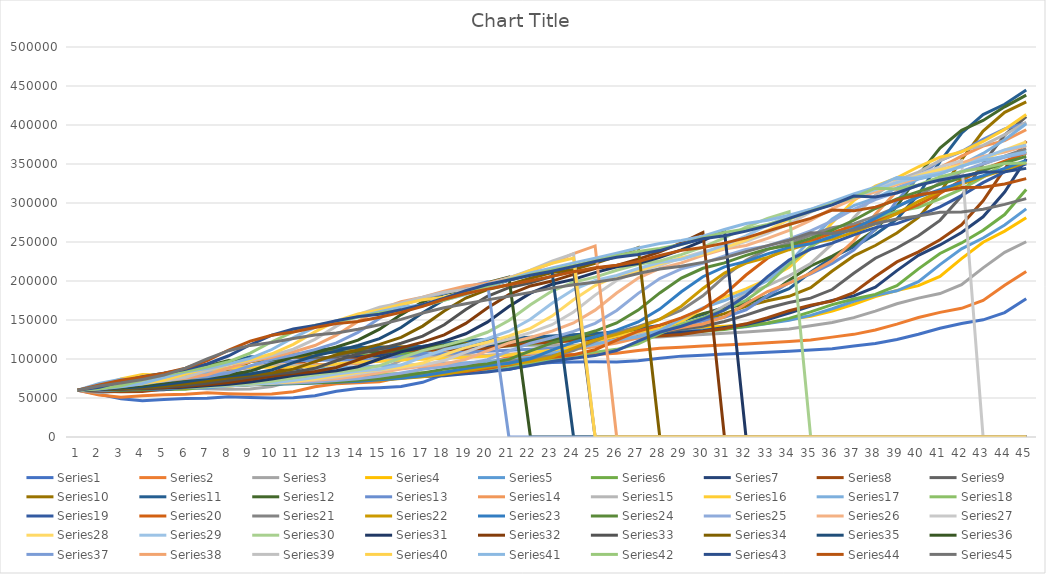
| Category | Series 0 | Series 1 | Series 2 | Series 3 | Series 4 | Series 5 | Series 6 | Series 7 | Series 8 | Series 9 | Series 10 | Series 11 | Series 12 | Series 13 | Series 14 | Series 15 | Series 16 | Series 17 | Series 18 | Series 19 | Series 20 | Series 21 | Series 22 | Series 23 | Series 24 | Series 25 | Series 26 | Series 27 | Series 28 | Series 29 | Series 30 | Series 31 | Series 32 | Series 33 | Series 34 | Series 35 | Series 36 | Series 37 | Series 38 | Series 39 | Series 40 | Series 41 | Series 42 | Series 43 | Series 44 |
|---|---|---|---|---|---|---|---|---|---|---|---|---|---|---|---|---|---|---|---|---|---|---|---|---|---|---|---|---|---|---|---|---|---|---|---|---|---|---|---|---|---|---|---|---|---|
| 0 | 60000 | 60000 | 60000 | 60000 | 60000 | 60000 | 60000 | 60000 | 60000 | 60000 | 60000 | 60000 | 60000 | 60000 | 60000 | 60000 | 60000 | 60000 | 60000 | 60000 | 60000 | 60000 | 60000 | 60000 | 60000 | 60000 | 60000 | 60000 | 60000 | 60000 | 60000 | 60000 | 60000 | 60000 | 60000 | 60000 | 60000 | 60000 | 60000 | 60000 | 60000 | 60000 | 60000 | 60000 | 60000 |
| 1 | 54640.719 | 53819.178 | 56884.545 | 62087.629 | 61531.756 | 60619.308 | 62235.577 | 58783.314 | 59219.397 | 60431.396 | 63069.601 | 66553.48 | 63581.633 | 60982.186 | 61364.282 | 65085.688 | 68633.646 | 64613.662 | 59417.678 | 60651.033 | 64716.066 | 61367.576 | 60489.642 | 60186.799 | 59832.402 | 60915.033 | 62004.905 | 61637.496 | 60606.411 | 60874.786 | 60642.434 | 60719.264 | 60743.802 | 60767.347 | 60951.102 | 61809.045 | 61663.671 | 62563.078 | 63277.432 | 63502.953 | 62575.66 | 61963.367 | 63706.656 | 66632.883 | 65485.888 |
| 2 | 49011.976 | 51024.658 | 58863.775 | 63672.68 | 62166.874 | 62877.96 | 60973.558 | 58018.54 | 59645.18 | 63523.068 | 69958.358 | 70526.316 | 64622.449 | 62368.801 | 66565.609 | 74451.135 | 73911.187 | 63986.562 | 60062.392 | 65418.271 | 66191.136 | 61868.379 | 60677.966 | 60018.68 | 60744.879 | 62950.514 | 63697.118 | 62260.457 | 61490.038 | 61526.587 | 61369.4 | 61471.982 | 61520.661 | 61730.612 | 62788.823 | 63522.878 | 64297.818 | 65980.515 | 66971.73 | 66228.987 | 64623.31 | 65791.315 | 70749.303 | 72725.225 | 69247.93 |
| 3 | 46467.066 | 52800 | 60366.524 | 64329.897 | 64483.188 | 61602.914 | 60180.288 | 58435.689 | 62696.629 | 70461.354 | 74134.444 | 71680.815 | 66091.837 | 67655.272 | 76144.008 | 80176.007 | 73193.851 | 64680.851 | 64783.362 | 66909.345 | 66731.302 | 62060.995 | 60508.475 | 60933.997 | 62774.674 | 64668.534 | 64340.895 | 63168.199 | 62148.426 | 62264.151 | 62130.178 | 62258.154 | 62495.868 | 63591.837 | 64529.823 | 66236.445 | 67810.013 | 69832.626 | 69846.67 | 68396.184 | 68615.583 | 73064.417 | 77218.015 | 76903.153 | 73750.211 |
| 4 | 48083.832 | 54147.945 | 60989.615 | 66726.804 | 63175.592 | 60801.457 | 60612.981 | 61425.261 | 69544.648 | 74667.466 | 75348.007 | 73310.696 | 71693.878 | 77390.467 | 81999.053 | 79397.869 | 73988.044 | 69764.838 | 66259.965 | 67455.373 | 66939.058 | 61887.64 | 61431.262 | 62970.112 | 64487.896 | 65322.129 | 65278.97 | 63844.557 | 62893.445 | 63036.021 | 62924.768 | 63245.052 | 64380.165 | 65355.102 | 67286.405 | 69854.536 | 71768.935 | 72830.377 | 72132.247 | 72621.536 | 76200.901 | 79744.803 | 81654.045 | 81903.153 | 79378.063 |
| 5 | 49311.377 | 54706.849 | 63262.065 | 65373.711 | 62353.674 | 61238.616 | 63713.942 | 68134.415 | 73696.038 | 75889.754 | 77061.273 | 79524.618 | 82010.204 | 83341.358 | 81203.221 | 80259.379 | 79803.587 | 71354.983 | 66800.693 | 67665.383 | 66752.078 | 62831.461 | 63483.992 | 64688.667 | 65139.665 | 66274.51 | 65977.928 | 64609.908 | 63673.116 | 63842.196 | 63922.232 | 65151.938 | 66165.289 | 68146.939 | 70961.848 | 73932.822 | 74849.807 | 75213.59 | 76588.404 | 80649.705 | 83168.062 | 84325.993 | 86962.933 | 88153.153 | 88311.644 |
| 6 | 49820.359 | 56745.205 | 61979.23 | 64523.196 | 62801.993 | 64371.585 | 70673.077 | 72201.622 | 74902.425 | 77615.339 | 83593.099 | 90967.742 | 88316.327 | 82532.499 | 82084.32 | 86567.855 | 81622.545 | 71937.29 | 67008.666 | 67476.374 | 67770.083 | 64930.979 | 65216.572 | 65342.466 | 66089.385 | 66984.127 | 66768.853 | 65410.857 | 64487.439 | 64854.202 | 65849.535 | 66958.461 | 68991.736 | 71869.388 | 75104.782 | 77106.586 | 77299.101 | 79860.105 | 85055.103 | 88023.626 | 87945.911 | 89808.603 | 93599.043 | 98074.324 | 100277.167 |
| 7 | 51676.647 | 55594.521 | 61172.877 | 64987.113 | 66014.944 | 71402.55 | 74891.827 | 73383.546 | 76605.559 | 84194.128 | 95621.654 | 97962.649 | 87459.184 | 83428.021 | 88536.239 | 88540.991 | 82288.642 | 72161.254 | 66821.49 | 68505.425 | 70034.626 | 66703.05 | 65875.706 | 66295.143 | 66797.02 | 67787.115 | 67596.567 | 66247.404 | 65509.674 | 66809.605 | 67675.402 | 69818.79 | 72760.331 | 76065.306 | 78328.855 | 79629.728 | 82074.454 | 88688.484 | 92831.816 | 93080.418 | 93663.876 | 96661.865 | 104133.121 | 111362.613 | 110640.527 |
| 8 | 50628.743 | 54871.233 | 61612.706 | 68311.856 | 73225.405 | 75664.845 | 76117.788 | 75052.144 | 83098.758 | 96309.167 | 102974.42 | 97011.885 | 88408.163 | 89985.556 | 90554.24 | 89263.548 | 82544.833 | 71959.686 | 67840.555 | 70794.54 | 71945.983 | 67377.207 | 66836.158 | 67004.981 | 67597.765 | 68627.451 | 68461.067 | 67297.538 | 67484.84 | 68662.093 | 70566.357 | 73632.562 | 77008.264 | 79330.612 | 80891.994 | 84549.061 | 91147.625 | 96797.402 | 98164.83 | 99132.213 | 100811.333 | 107540.646 | 118242.328 | 122871.622 | 117424.37 |
| 9 | 49970.06 | 55265.753 | 64764.814 | 75773.196 | 77596.513 | 76903.461 | 77848.558 | 81413.673 | 95056.18 | 103714.799 | 101975.015 | 98064.516 | 95357.143 | 92036.591 | 91293.226 | 89541.454 | 82314.261 | 73057.111 | 70107.452 | 72726.636 | 72673.13 | 68359.551 | 67551.789 | 67808.219 | 68435.754 | 69505.135 | 69546.291 | 69326.609 | 69356.05 | 71595.197 | 74420.964 | 77931.419 | 80314.05 | 81926.531 | 85889.307 | 93895.795 | 99481.386 | 102358.231 | 104547.197 | 106696.956 | 112157.115 | 122111.546 | 130462.336 | 130405.405 | 121196.552 |
| 10 | 50329.341 | 58093.151 | 71838.729 | 80296.392 | 78866.75 | 78652.095 | 84447.115 | 93128.621 | 102365.464 | 102708.209 | 103081.499 | 105772.496 | 97530.612 | 92787.675 | 91577.451 | 89291.339 | 83569.599 | 75498.32 | 72020.797 | 73461.673 | 73732.687 | 69091.493 | 68361.582 | 68648.817 | 69310.987 | 70606.909 | 71643.164 | 71248.888 | 72318.799 | 75506.003 | 78765.85 | 81276.833 | 82942.149 | 86987.755 | 95384.202 | 102480.825 | 105196.406 | 109013.24 | 112525.156 | 118705.134 | 127353.509 | 134731.426 | 138461.538 | 134594.595 | 126408.653 |
| 11 | 52904.192 | 64438.356 | 76127.062 | 81610.825 | 80660.025 | 85318.761 | 96598.558 | 100289.687 | 101371.969 | 103822.648 | 111183.819 | 108183.362 | 98326.531 | 93076.553 | 91321.648 | 90653.08 | 86362.084 | 77558.791 | 72748.7 | 74532.727 | 74522.161 | 69919.743 | 69209.04 | 69526.775 | 70409.683 | 72735.761 | 73629.675 | 74292.495 | 76269.131 | 79914.237 | 82147.084 | 83936.437 | 88066.116 | 96604.082 | 104105.32 | 108368.157 | 112035.944 | 117332.001 | 125189.267 | 134788.732 | 140515.132 | 142992.385 | 142909.526 | 140382.883 | 130890.654 |
| 12 | 58682.635 | 68284.932 | 77373.244 | 83466.495 | 87496.887 | 97595.628 | 104026.442 | 99316.338 | 102471.91 | 111983.223 | 113718.025 | 109066.214 | 98632.653 | 92816.562 | 92714.353 | 93682.26 | 88719.044 | 78342.665 | 73809.359 | 75330.767 | 75415.512 | 70786.517 | 70094.162 | 70628.892 | 72532.588 | 74752.568 | 76774.985 | 78350.638 | 80721.917 | 83344.768 | 84835.165 | 89121.829 | 97801.653 | 105436.735 | 110085.975 | 115413.912 | 120585.366 | 130537.097 | 142151.414 | 148718.764 | 149130.715 | 147585.923 | 149055.4 | 145360.36 | 133375.021 |
| 13 | 62185.629 | 69402.74 | 79132.56 | 90541.237 | 100087.173 | 105100.182 | 103016.827 | 100393.975 | 110526.316 | 114535.65 | 114646.044 | 109405.772 | 98357.143 | 94232.065 | 95812.411 | 96239 | 89615.713 | 79484.882 | 74599.653 | 76233.812 | 76350.416 | 71691.814 | 71205.273 | 72758.406 | 74543.762 | 77945.845 | 80968.731 | 82924.948 | 84187.121 | 86072.041 | 90076.078 | 98974.073 | 106743.802 | 111493.878 | 117243.417 | 124221.106 | 134156.611 | 148223.832 | 156842.357 | 157837.347 | 153921.442 | 153932.908 | 154340.375 | 148119.369 | 138262.633 |
| 14 | 63203.593 | 70980.822 | 85839.951 | 103569.588 | 107783.313 | 104080.146 | 104134.615 | 108285.052 | 113045.535 | 115470.342 | 115002.974 | 109100.17 | 99857.143 | 97380.838 | 98427.286 | 97211.672 | 90922.289 | 80335.946 | 75493.934 | 77178.859 | 77326.87 | 72828.25 | 73352.166 | 74775.841 | 77728.119 | 82203.548 | 85695.892 | 86484.723 | 86941.958 | 91389.365 | 100033.812 | 108023.418 | 112876.033 | 118742.857 | 126190.22 | 138201.534 | 152333.761 | 163542.343 | 166459.032 | 162907.769 | 160540.889 | 159390.821 | 157269.829 | 153547.297 | 143900.625 |
| 15 | 64640.719 | 76997.26 | 98191.814 | 111533.505 | 106737.235 | 105209.472 | 112319.711 | 110753.187 | 113968.066 | 115829.838 | 114681.737 | 110764.007 | 103193.878 | 100038.517 | 99422.075 | 98628.995 | 91895.816 | 81298.992 | 76429.809 | 78165.908 | 78552.632 | 75024.077 | 75386.064 | 77970.112 | 81973.929 | 87002.801 | 89374.617 | 89314.743 | 92313.023 | 101492.281 | 109180.051 | 114229.161 | 120214.876 | 127804.082 | 140392.262 | 156926.739 | 168077.022 | 173569.823 | 171806.421 | 169913.676 | 166233.097 | 162416.135 | 163033.081 | 159808.559 | 150846.713 |
| 16 | 70119.76 | 88076.712 | 105742.211 | 110451.031 | 107895.392 | 113479.053 | 114879.808 | 111657.01 | 114322.886 | 115506.291 | 116430.696 | 114465.195 | 106010.204 | 101049.591 | 100871.625 | 99685.039 | 92997.438 | 82306.831 | 77407.279 | 79404.97 | 80921.053 | 77104.334 | 78606.403 | 82229.141 | 86759.777 | 90737.628 | 92299.203 | 94832.394 | 102518.048 | 110771.87 | 115452.24 | 121655.98 | 129388.43 | 142187.755 | 159414.293 | 173144.671 | 178382.542 | 179145.641 | 179195.017 | 175938.21 | 169388.281 | 168367.977 | 169681.148 | 167522.523 | 158989.353 |
| 17 | 80209.581 | 94849.315 | 104715.944 | 111649.485 | 116376.09 | 116065.574 | 115817.308 | 112004.635 | 114003.548 | 117267.825 | 120321.237 | 117589.134 | 107081.633 | 102522.87 | 101951.682 | 100880.037 | 94150.299 | 83359.462 | 78634.315 | 81799.09 | 83164.82 | 80398.074 | 82900.188 | 87029.888 | 90484.171 | 93706.816 | 98001.226 | 105315.93 | 111891.424 | 117135.506 | 122958.58 | 130939.504 | 143950.413 | 161453.061 | 175889.307 | 183760.91 | 184112.965 | 186849.863 | 185548.634 | 179277.601 | 175595.621 | 175233.587 | 177871.662 | 176565.315 | 165722.495 |
| 18 | 86377.246 | 93928.767 | 105852.169 | 120425.258 | 119028.643 | 117012.75 | 116177.885 | 111691.773 | 115742.164 | 121186.339 | 123604.997 | 118777.589 | 108642.857 | 103620.607 | 103173.851 | 102130.616 | 95354.398 | 84680.851 | 81005.199 | 84067.203 | 86717.452 | 84789.727 | 87740.113 | 90765.878 | 93445.065 | 99495.798 | 108835.071 | 114945.12 | 118319.376 | 124751.286 | 132341.505 | 145676.052 | 163454.545 | 178138.776 | 186673.831 | 189664.11 | 192030.809 | 193474.894 | 189070.436 | 185847.342 | 182755.956 | 183692.118 | 187473.097 | 184042.793 | 170741.93 |
| 19 | 85538.922 | 94947.945 | 114172.266 | 123170.103 | 120000 | 117377.049 | 115853.365 | 113395.133 | 119609.698 | 124493.709 | 124854.253 | 120509.338 | 109806.122 | 104862.783 | 104452.866 | 103436.776 | 96865.927 | 87234.043 | 83251.3 | 87658.383 | 91454.294 | 89739.968 | 91506.591 | 93735.99 | 99217.877 | 110494.865 | 118786.021 | 121548.502 | 126012.128 | 134271.012 | 147235.841 | 165413.995 | 180347.107 | 189061.224 | 192670.607 | 197820.682 | 198839.538 | 197147.14 | 195999.042 | 193425.716 | 191577.592 | 193607.738 | 195412.515 | 189617.117 | 175781.646 |
| 20 | 86467.066 | 102410.959 | 116774.588 | 124175.258 | 120373.599 | 117049.18 | 117620.192 | 117184.241 | 122874.039 | 125751.947 | 126674.598 | 121799.66 | 111122.449 | 106162.735 | 105788.726 | 105076.424 | 99786.507 | 89652.856 | 86807.626 | 92446.622 | 96793.629 | 93592.295 | 94500.942 | 99526.775 | 110186.22 | 120597.572 | 125610.055 | 129451.201 | 135628.068 | 149382.504 | 167185.123 | 182509.06 | 191404.959 | 195134.694 | 200956.475 | 204834.7 | 0 | 204371.721 | 203991.375 | 202762.381 | 201918.867 | 201806.956 | 201331.208 | 195213.964 | 180365.05 |
| 21 | 93263.473 | 104745.206 | 117727.55 | 124561.856 | 120037.36 | 118834.244 | 121550.481 | 120382.387 | 124115.908 | 127585.38 | 128030.934 | 123259.762 | 112500 | 107520.462 | 107465.656 | 108244.558 | 102553.373 | 93482.643 | 91549.393 | 97843.892 | 100948.753 | 96654.896 | 100338.983 | 110529.265 | 120260.708 | 127525.677 | 133776.824 | 139329.576 | 150892.29 | 169622.642 | 184463.229 | 193699.47 | 197553.719 | 203526.531 | 208081.677 | 0 | 0 | 212705.471 | 213838.045 | 213707.406 | 210470.058 | 207919.325 | 207273.814 | 200304.054 | 185425.046 |
| 22 | 95389.222 | 105600 | 118094.074 | 124213.918 | 121867.995 | 122805.1 | 124867.788 | 121599.073 | 125925.488 | 128951.468 | 129565.735 | 124787.776 | 113938.776 | 109224.844 | 110705.827 | 111245.947 | 106934.244 | 98589.026 | 96894.281 | 102044.102 | 104252.078 | 102626.003 | 111431.262 | 120635.118 | 127169.46 | 135816.993 | 143985.285 | 155010.383 | 171336.991 | 187152.659 | 195773.457 | 199921.94 | 206049.587 | 210742.857 | 212031.166 | 0 | 0 | 222972.771 | 225380.93 | 222757.837 | 216844.817 | 214056.39 | 212678.358 | 205923.423 | 190860.233 |
| 23 | 96167.665 | 105928.767 | 117764.203 | 126108.247 | 125940.224 | 126156.648 | 126129.808 | 123371.958 | 127273.802 | 130497.304 | 131171.922 | 126383.701 | 115744.898 | 112518.055 | 113775.462 | 115998.147 | 112775.406 | 104344.905 | 101053.726 | 105383.269 | 110692.521 | 113971.108 | 121619.586 | 127565.38 | 135437.616 | 146181.139 | 160190.067 | 176013.052 | 189044.181 | 198627.787 | 202062.553 | 208519.654 | 213355.372 | 214742.857 | 0 | 0 | 0 | 235008.743 | 234925.731 | 229504.771 | 223245.332 | 219637.786 | 218644.878 | 211959.459 | 195321.954 |
| 24 | 96467.066 | 105632.877 | 119560.171 | 130322.165 | 129377.335 | 127431.694 | 127968.75 | 124692.932 | 128799.527 | 132115.039 | 132849.494 | 128387.097 | 119234.694 | 115637.939 | 118635.718 | 122334.414 | 119359.522 | 108824.188 | 104360.485 | 111893.595 | 122929.363 | 124391.653 | 128606.403 | 135859.278 | 145772.812 | 162633.053 | 181894.543 | 194203.5 | 200635.287 | 205008.576 | 210752.325 | 215913.019 | 0 | 222612.245 | 0 | 0 | 0 | 244961.279 | 0 | 0 | 229066.323 | 225799.547 | 225053.806 | 216914.414 | 198353.896 |
| 25 | 96197.605 | 107243.836 | 123555.284 | 133878.866 | 130684.932 | 129289.617 | 129338.942 | 126187.717 | 130396.215 | 133804.674 | 134955.384 | 132258.065 | 122540.816 | 120577.756 | 125116.059 | 129476.61 | 124483.348 | 112385.218 | 110807.626 | 124263.213 | 134168.975 | 131537.721 | 136967.985 | 146226.65 | 162178.771 | 184668.534 | 200692.827 | 206110.946 | 207080.566 | 213825.043 | 218224.852 | 220011.151 | 0 | 231689.796 | 0 | 0 | 0 | 0 | 0 | 0 | 235492.595 | 232418.193 | 230314.867 | 220281.531 | 202693.933 |
| 26 | 97664.671 | 110827.397 | 126927.306 | 135231.959 | 132590.286 | 130673.953 | 130889.423 | 127752.028 | 132063.868 | 135925.704 | 139024.39 | 135925.297 | 127775.51 | 127164.179 | 132420.654 | 135034.738 | 128556.789 | 119328.108 | 123057.192 | 135624.781 | 141876.731 | 140089.888 | 147419.962 | 162683.686 | 184152.7 | 203753.501 | 212998.161 | 212732.127 | 215986.139 | 221406.518 | 222366.864 | 228073.599 | 0 | 242873.469 | 0 | 0 | 0 | 0 | 0 | 0 | 242395.364 | 237851.41 | 233889.996 | 225101.351 | 209538.618 |
| 27 | 100928.144 | 113852.055 | 128210.14 | 137203.608 | 134009.963 | 132240.437 | 132512.019 | 129385.863 | 134157.303 | 140023.966 | 142879.239 | 141731.749 | 134755.102 | 134588.349 | 138105.163 | 139453.451 | 136498.719 | 132519.597 | 134308.492 | 143416.171 | 151101.108 | 150780.096 | 164011.299 | 184726.027 | 203184.358 | 216246.499 | 219840.589 | 221880.747 | 223644.239 | 225608.919 | 230515.638 | 237373.85 | 0 | 0 | 0 | 0 | 0 | 0 | 0 | 0 | 248061.816 | 241543.527 | 239007.573 | 232702.703 | 215460.537 |
| 28 | 103682.635 | 115002.74 | 130079.414 | 138672.68 | 135616.438 | 133879.781 | 134206.731 | 131436.848 | 138202.247 | 143906.531 | 148982.748 | 149473.684 | 142622.449 | 140365.912 | 142624.349 | 148068.55 | 151588.386 | 144636.058 | 142024.263 | 152740.637 | 162631.579 | 167749.599 | 186233.522 | 203816.936 | 215642.458 | 223193.277 | 229294.911 | 229747.849 | 227889.113 | 233876.501 | 239915.469 | 248831.893 | 0 | 0 | 0 | 0 | 0 | 0 | 0 | 0 | 251912.428 | 246828.566 | 247078.517 | 239279.279 | 218877.81 |
| 29 | 104730.539 | 116679.452 | 131472.205 | 140335.052 | 137297.634 | 135591.985 | 136334.135 | 135399.768 | 142034.299 | 150053.925 | 157120.761 | 158200.34 | 148744.898 | 144959.076 | 151435.339 | 164437.239 | 165448.335 | 152945.129 | 151258.232 | 164396.22 | 180934.903 | 190478.331 | 205480.226 | 216313.823 | 222569.832 | 232791.783 | 237424.893 | 234108.573 | 236240.254 | 243413.379 | 251496.196 | 262263.73 | 0 | 0 | 0 | 0 | 0 | 0 | 0 | 0 | 257424.34 | 255163.614 | 254061.379 | 243074.324 | 223846.544 |
| 30 | 106257.485 | 117928.767 | 133048.259 | 142074.742 | 139053.549 | 137741.348 | 140444.711 | 139154.114 | 148101.715 | 158250.449 | 166293.873 | 164991.511 | 153612.245 | 153914.3 | 168176.22 | 179471.978 | 174953.032 | 162889.138 | 162800.693 | 182898.145 | 205450.138 | 210163.724 | 218079.096 | 223262.765 | 232141.527 | 241045.752 | 241931.33 | 242687.63 | 245873.52 | 255162.95 | 265071.851 | 0 | 0 | 0 | 0 | 0 | 0 | 0 | 0 | 0 | 266117.193 | 262374.974 | 258090.873 | 248592.342 | 229839.446 |
| 31 | 107395.21 | 119342.466 | 134697.618 | 143891.753 | 141257.783 | 141894.353 | 144338.942 | 145098.494 | 156191.603 | 167489.515 | 173432.481 | 170390.492 | 163102.041 | 170929.225 | 183552.819 | 189782.307 | 186327.925 | 175319.149 | 181123.05 | 207679.384 | 226682.825 | 223049.759 | 225084.746 | 232864.259 | 240372.44 | 245620.915 | 250797.057 | 252583.803 | 257741.842 | 268936.535 | 0 | 0 | 0 | 0 | 0 | 0 | 0 | 0 | 0 | 0 | 273638.12 | 266536.324 | 263949.781 | 255247.748 | 237637.316 |
| 32 | 108682.635 | 120821.918 | 136420.281 | 146172.68 | 145516.812 | 145828.78 | 150504.808 | 153024.334 | 165310.467 | 174679.449 | 179107.674 | 180916.808 | 181132.653 | 186557.535 | 194097.584 | 202121.352 | 200546.541 | 195050.392 | 205663.778 | 229142.457 | 240581.717 | 230215.088 | 234764.595 | 241120.797 | 244934.823 | 254621.849 | 261023.912 | 264776.031 | 271654.635 | 280325.901 | 0 | 0 | 0 | 0 | 0 | 0 | 0 | 0 | 0 | 0 | 277978.107 | 272586.952 | 271016.341 | 263907.658 | 245303.363 |
| 33 | 110029.94 | 122367.123 | 138582.773 | 150579.897 | 149551.681 | 152058.288 | 158725.961 | 161958.285 | 172406.86 | 180395.446 | 190172.516 | 200916.808 | 197693.878 | 197274.916 | 206717.196 | 217545.16 | 223116.994 | 221478.163 | 226918.544 | 243192.16 | 248310.249 | 240115.57 | 243088.512 | 245697.385 | 253910.615 | 265004.668 | 273623.544 | 279068.526 | 283159.111 | 288816.467 | 0 | 0 | 0 | 0 | 0 | 0 | 0 | 0 | 0 | 0 | 284288.474 | 279884.75 | 280211.24 | 272421.171 | 252301.065 |
| 34 | 111437.126 | 124306.849 | 142761.148 | 154755.155 | 155940.224 | 160364.299 | 167992.788 | 168910.776 | 178048.492 | 191539.844 | 211195.717 | 219286.927 | 209051.02 | 210101.107 | 222491.71 | 242028.717 | 253347.566 | 244367.301 | 240831.889 | 251004.55 | 258988.92 | 248629.214 | 247702.448 | 254701.121 | 264264.432 | 277796.452 | 288393.624 | 290886.977 | 291735.49 | 0 | 0 | 0 | 0 | 0 | 0 | 0 | 0 | 0 | 0 | 0 | 291899.549 | 289380.531 | 289250.698 | 280192.455 | 261987.156 |
| 35 | 113203.593 | 128054.795 | 146719.609 | 161365.979 | 164458.281 | 169726.776 | 175204.327 | 174438.007 | 189047.901 | 212714.2 | 230505.651 | 231884.55 | 222642.857 | 226133.847 | 247531.975 | 274821.677 | 279530.316 | 259350.504 | 248568.458 | 261799.09 | 268171.745 | 253348.315 | 256779.661 | 265087.173 | 277020.484 | 292791.783 | 300606.99 | 299697.419 | 300346.52 | 0 | 0 | 0 | 0 | 0 | 0 | 0 | 0 | 0 | 0 | 0 | 301802.962 | 298715.785 | 297502.073 | 290949.324 | 261055.67 |
| 36 | 116616.766 | 131605.479 | 152987.172 | 170180.412 | 174059.776 | 177012.75 | 180937.5 | 185214.369 | 209946.777 | 232162.972 | 243747.769 | 246960.951 | 239632.653 | 251584.015 | 281070.583 | 303223.715 | 296669.513 | 267681.971 | 259258.232 | 271081.554 | 273261.773 | 262632.424 | 267250.471 | 277882.939 | 291973.929 | 305191.41 | 309711.833 | 308543.459 | 308177.88 | 0 | 0 | 0 | 0 | 0 | 0 | 0 | 0 | 0 | 0 | 0 | 311538.957 | 307237.168 | 308923.475 | 289914.865 | 265337.097 |
| 37 | 119850.299 | 137227.397 | 161343.922 | 180115.979 | 181531.756 | 182805.1 | 192115.385 | 205689.455 | 229142.519 | 245500.3 | 259595.479 | 265806.452 | 266602.041 | 285671.642 | 310118.427 | 321815.655 | 306199.829 | 279193.729 | 268450.607 | 276226.811 | 283275.623 | 273341.894 | 280150.659 | 292882.939 | 304338.92 | 314435.107 | 318853.464 | 316588.549 | 316823.563 | 0 | 0 | 0 | 0 | 0 | 0 | 0 | 0 | 0 | 0 | 0 | 320426.143 | 319032.311 | 307825.11 | 294669.595 | 273713.368 |
| 38 | 124970.06 | 144723.288 | 170763.592 | 187847.938 | 187471.98 | 194098.361 | 213353.365 | 224495.944 | 242306.328 | 261461.953 | 279405.116 | 295721.562 | 302724.49 | 315194.993 | 329133.112 | 332153.775 | 319368.061 | 289092.945 | 273545.927 | 286349.318 | 294826.87 | 286536.116 | 295273.07 | 305286.426 | 313556.797 | 323716.153 | 327167.382 | 325470.187 | 326110.309 | 0 | 0 | 0 | 0 | 0 | 0 | 0 | 0 | 0 | 0 | 0 | 332727.624 | 317898.004 | 312873.575 | 303971.847 | 279377.421 |
| 39 | 131796.407 | 153172.603 | 178094.074 | 193994.845 | 199053.549 | 215555.556 | 232860.577 | 237392.816 | 258060.319 | 281414.02 | 310850.684 | 335789.474 | 334010.204 | 334520.944 | 339706.3 | 346438.166 | 330691.717 | 294580.067 | 283570.191 | 298025.901 | 309058.172 | 302003.21 | 307777.778 | 314533.001 | 322811.918 | 332156.863 | 336345.8 | 335010.383 | 333733.757 | 0 | 0 | 0 | 0 | 0 | 0 | 0 | 0 | 0 | 0 | 0 | 331544.623 | 323111.669 | 322750.498 | 310262.05 | 283469.833 |
| 40 | 139491.018 | 159747.945 | 183921.808 | 205979.381 | 221058.531 | 235264.117 | 246237.981 | 252827.347 | 277752.809 | 313085.68 | 352968.471 | 370492.36 | 354489.796 | 345267.212 | 354315.49 | 358721.63 | 336968.403 | 305375.14 | 295133.449 | 312411.621 | 325740.997 | 314792.938 | 317099.812 | 323816.936 | 331229.05 | 341475.257 | 346204.782 | 342841.887 | 338914.236 | 0 | 0 | 0 | 0 | 0 | 0 | 0 | 0 | 0 | 0 | 0 | 336982.099 | 333311.793 | 329429.295 | 314806.869 | 288068.346 |
| 41 | 145479.042 | 164975.343 | 195284.056 | 228750 | 241270.237 | 248779.599 | 262247.596 | 272120.51 | 309012.419 | 355506.291 | 389446.758 | 393208.829 | 365877.551 | 360115.551 | 366878.257 | 365530.338 | 349316.823 | 317827.548 | 309379.549 | 329275.464 | 339536.011 | 324327.448 | 326459.51 | 332260.274 | 340521.415 | 351484.594 | 354297.977 | 348163.75 | 346329.772 | 0 | 0 | 0 | 0 | 0 | 0 | 0 | 0 | 0 | 0 | 0 | 347620.09 | 340209.138 | 334254.882 | 319913.739 | 288410.073 |
| 42 | 150239.521 | 175167.123 | 216872.327 | 249664.949 | 255130.76 | 264954.463 | 282259.615 | 302746.234 | 350881.135 | 392246.854 | 413325.402 | 405840.407 | 381612.245 | 372883.967 | 373841.781 | 378925.428 | 363561.059 | 333169.093 | 326079.723 | 343220.161 | 349819.945 | 333900.482 | 334971.751 | 341581.569 | 350502.793 | 359701.214 | 0 | 355781.667 | 358024.834 | 0 | 0 | 0 | 0 | 0 | 0 | 0 | 0 | 0 | 0 | 0 | 354813.522 | 345192.632 | 339677.242 | 320293.243 | 292048.606 |
| 43 | 159520.958 | 194531.507 | 236701.283 | 264007.732 | 271718.555 | 285173.042 | 314026.442 | 343765.933 | 387143.702 | 416297.184 | 426603.212 | 423293.718 | 395142.857 | 379961.483 | 387541.449 | 394377.026 | 381110.162 | 351153.415 | 339889.081 | 353615.681 | 360145.429 | 342606.742 | 344369.115 | 351594.022 | 358696.462 | 365284.781 | 0 | 367795.906 | 368143.229 | 0 | 0 | 0 | 0 | 0 | 0 | 0 | 0 | 0 | 0 | 0 | 360010.947 | 350792.426 | 340080.191 | 324334.009 | 298269.562 |
| 44 | 177155.689 | 212317.808 | 250299.328 | 281172.68 | 292453.3 | 317267.76 | 356574.519 | 379293.163 | 410881.135 | 429670.461 | 444949.435 | 438302.207 | 402642.857 | 393885.412 | 403344.386 | 413413.617 | 401682.323 | 366024.636 | 350183.709 | 364053.203 | 369536.011 | 352218.299 | 354463.277 | 359813.201 | 364264.432 | 373277.311 | 0 | 378190.448 | 373982.096 | 0 | 0 | 0 | 0 | 0 | 0 | 0 | 0 | 0 | 0 | 0 | 365851.127 | 351208.561 | 344370.586 | 331242.68 | 305555.045 |